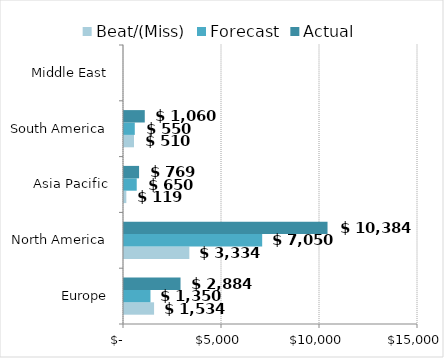
| Category | Beat/(Miss) | Forecast | Actual |
|---|---|---|---|
| Europe | 1534 | 1350 | 2884 |
| North America | 3334 | 7050 | 10384 |
| Asia Pacific | 119 | 650 | 769 |
| South America | 510 | 550 | 1060 |
| Middle East | 0 | 0 | 0 |